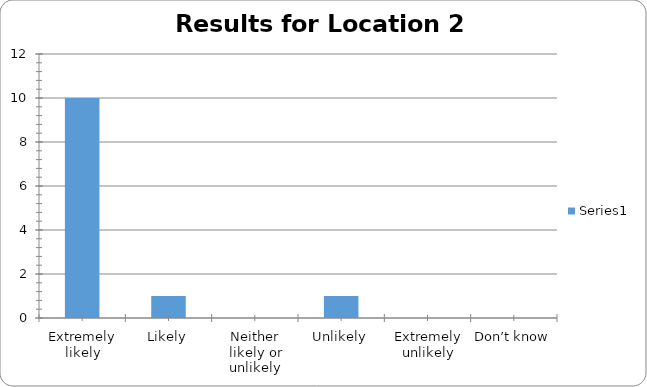
| Category | Series 0 |
|---|---|
| Extremely likely | 10 |
| Likely | 1 |
| Neither likely or unlikely | 0 |
| Unlikely | 1 |
| Extremely unlikely | 0 |
| Don’t know | 0 |